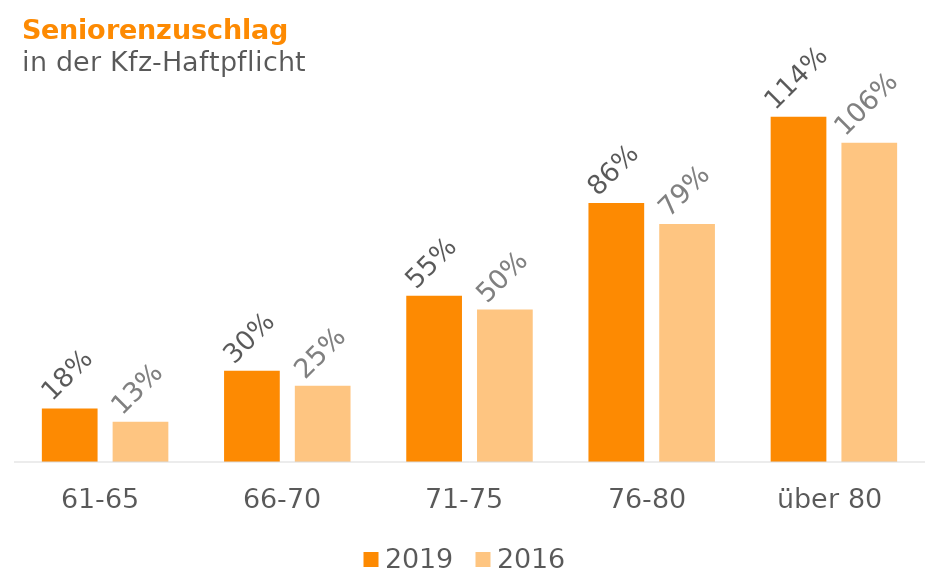
| Category | 2019 | 2016 |
|---|---|---|
| 61-65 | 0.177 | 0.133 |
| 66-70 | 0.302 | 0.252 |
| 71-75 | 0.55 | 0.504 |
| 76-80 | 0.856 | 0.787 |
| über 80 | 1.141 | 1.055 |